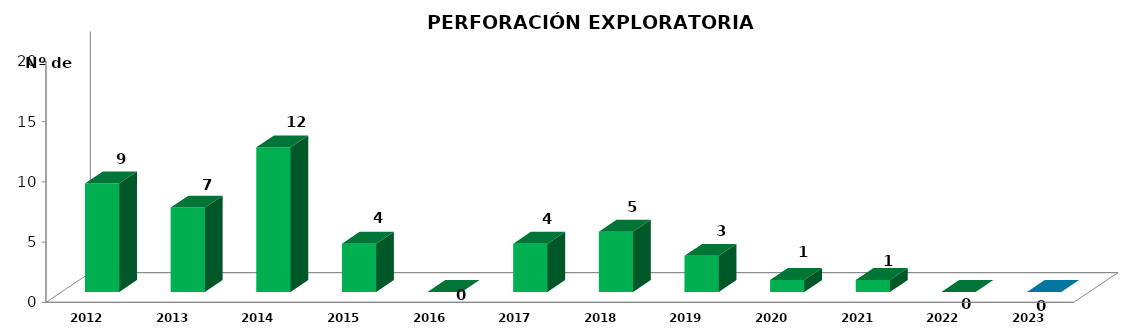
| Category | Series 0 |
|---|---|
| 2012.0 | 9 |
| 2013.0 | 7 |
| 2014.0 | 12 |
| 2015.0 | 4 |
| 2016.0 | 0 |
| 2017.0 | 4 |
| 2018.0 | 5 |
| 2019.0 | 3 |
| 2020.0 | 1 |
| 2021.0 | 1 |
| 2022.0 | 0 |
| 2023.0 | 0 |